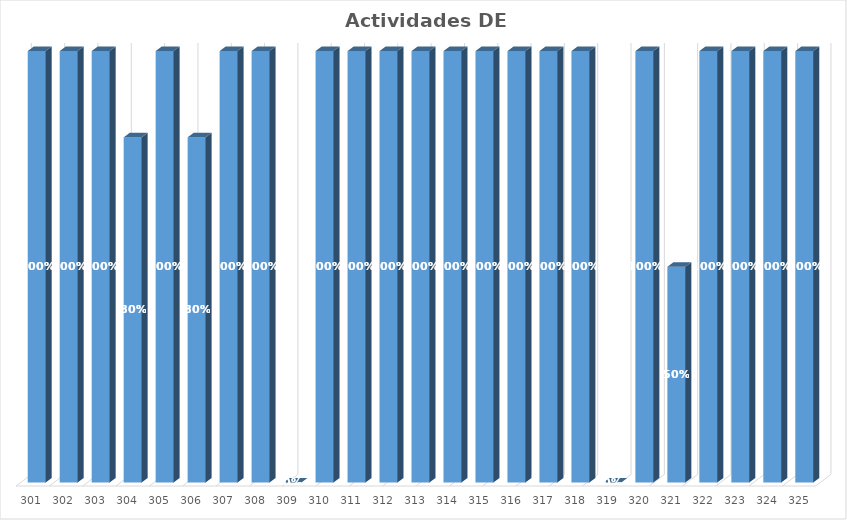
| Category | % Avance |
|---|---|
| 301.0 | 1 |
| 302.0 | 1 |
| 303.0 | 1 |
| 304.0 | 0.8 |
| 305.0 | 1 |
| 306.0 | 0.8 |
| 307.0 | 1 |
| 308.0 | 1 |
| 309.0 | 0 |
| 310.0 | 1 |
| 311.0 | 1 |
| 312.0 | 1 |
| 313.0 | 1 |
| 314.0 | 1 |
| 315.0 | 1 |
| 316.0 | 1 |
| 317.0 | 1 |
| 318.0 | 1 |
| 319.0 | 0 |
| 320.0 | 1 |
| 321.0 | 0.5 |
| 322.0 | 1 |
| 323.0 | 1 |
| 324.0 | 1 |
| 325.0 | 1 |